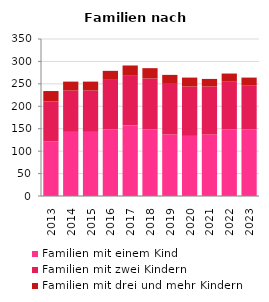
| Category | Familien mit einem Kind | Familien mit zwei Kindern | Familien mit drei und mehr Kindern |
|---|---|---|---|
| 2013.0 | 122 | 89 | 23 |
| 2014.0 | 143 | 92 | 20 |
| 2015.0 | 143 | 92 | 20 |
| 2016.0 | 149 | 110 | 20 |
| 2017.0 | 158 | 110 | 23 |
| 2018.0 | 149 | 113 | 23 |
| 2019.0 | 137 | 113 | 20 |
| 2020.0 | 134 | 110 | 20 |
| 2021.0 | 137 | 107 | 17 |
| 2022.0 | 149 | 107 | 17 |
| 2023.0 | 149 | 98 | 17 |